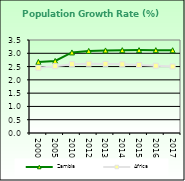
| Category | Zambia | Africa  |
|---|---|---|
| 2000.0 | 2.676 | 2.458 |
| 2005.0 | 2.712 | 2.516 |
| 2010.0 | 3.032 | 2.59 |
| 2012.0 | 3.089 | 2.606 |
| 2013.0 | 3.108 | 2.601 |
| 2014.0 | 3.117 | 2.584 |
| 2015.0 | 3.119 | 2.559 |
| 2016.0 | 3.119 | 2.531 |
| 2017.0 | 3.114 | 2.503 |